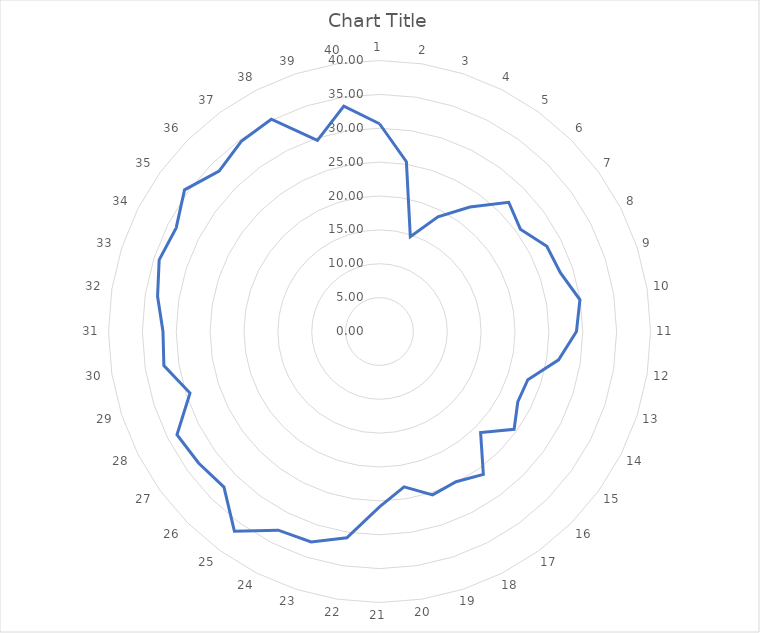
| Category | Series 0 |
|---|---|
| 0 | 30.664 |
| 1 | 25.374 |
| 2 | 14.721 |
| 3 | 19 |
| 4 | 22.698 |
| 5 | 26.976 |
| 6 | 25.705 |
| 7 | 27.72 |
| 8 | 28.068 |
| 9 | 29.955 |
| 10 | 29.072 |
| 11 | 26.765 |
| 12 | 23.02 |
| 13 | 22.905 |
| 14 | 24.562 |
| 15 | 21.105 |
| 16 | 26.077 |
| 17 | 24.89 |
| 18 | 25.362 |
| 19 | 23.216 |
| 20 | 25.873 |
| 21 | 30.822 |
| 22 | 32.666 |
| 23 | 32.913 |
| 24 | 36.436 |
| 25 | 32.468 |
| 26 | 33.017 |
| 27 | 33.551 |
| 28 | 29.412 |
| 29 | 32.224 |
| 30 | 31.959 |
| 31 | 33.167 |
| 32 | 34.195 |
| 33 | 33.685 |
| 34 | 35.568 |
| 35 | 33.482 |
| 36 | 34.71 |
| 37 | 35.172 |
| 38 | 29.662 |
| 39 | 33.67 |